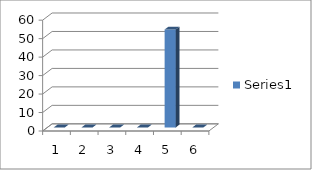
| Category | Series 0 |
|---|---|
| 0 | 0 |
| 1 | 0 |
| 2 | 0 |
| 3 | 0 |
| 4 | 53 |
| 5 | 0 |